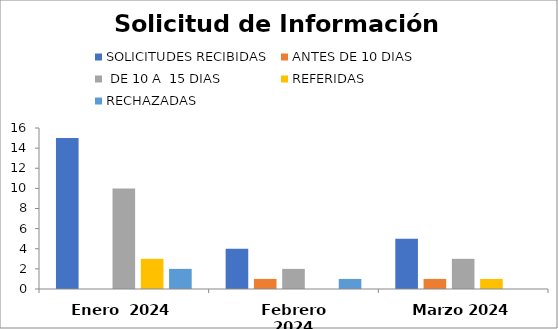
| Category | SOLICITUDES RECIBIDAS | ANTES DE 10 DIAS |  DE 10 A  15 DIAS  | REFERIDAS | RECHAZADAS |
|---|---|---|---|---|---|
| Enero  2024 | 15 | 0 | 10 | 3 | 2 |
| Febrero 2024 | 4 | 1 | 2 | 0 | 1 |
| Marzo 2024 | 5 | 1 | 3 | 1 | 0 |